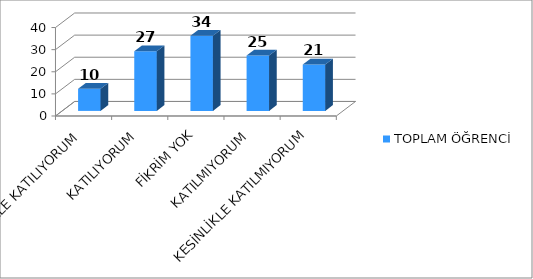
| Category | TOPLAM ÖĞRENCİ |
|---|---|
| KESİNLİKLE KATILIYORUM | 10 |
| KATILIYORUM | 27 |
| FİKRİM YOK | 34 |
| KATILMIYORUM | 25 |
| KESİNLİKLE KATILMIYORUM | 21 |